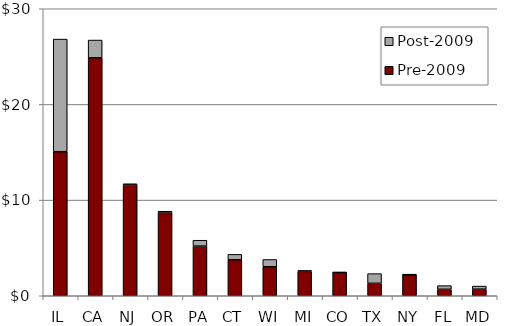
| Category | Pre-2009                   | Post-2009 |
|---|---|---|
| IL | 15057309.008 | 11773437.309 |
| CA | 24873873.02 | 1855238.099 |
| NJ | 11578337.37 | 130384.215 |
| OR | 8748700.75 | 88327.836 |
| PA | 5190809.995 | 612737.402 |
| CT | 3766304.377 | 558903.245 |
| WI | 3033421.344 | 757470.216 |
| MI | 2552349.696 | 90516.893 |
| CO | 2439763.528 | 9768.015 |
| TX | 1300447.249 | 1014520.329 |
| NY | 2206239.434 | 1873.278 |
| FL | 675358.729 | 384234.525 |
| MD | 688481.812 | 321694.342 |